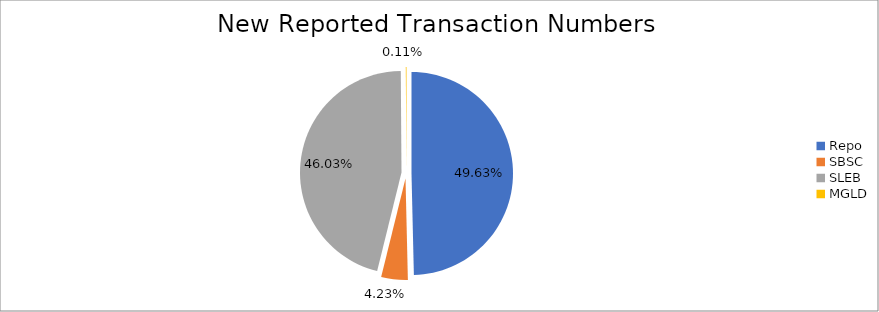
| Category | Series 0 |
|---|---|
| Repo | 353615 |
| SBSC | 30128 |
| SLEB | 328005 |
| MGLD | 814 |